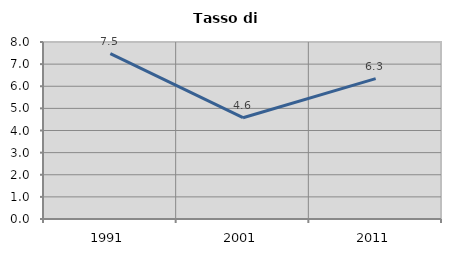
| Category | Tasso di disoccupazione   |
|---|---|
| 1991.0 | 7.473 |
| 2001.0 | 4.577 |
| 2011.0 | 6.345 |